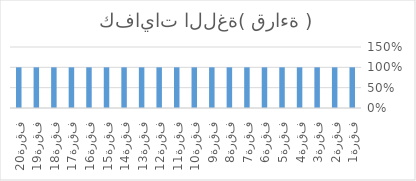
| Category | Series 0 |
|---|---|
| فقرة1 | 1 |
| فقرة2 | 1 |
| فقرة3 | 1 |
| فقرة4 | 1 |
| فقرة5 | 1 |
| فقرة6 | 1 |
| فقرة7 | 1 |
| فقرة8 | 1 |
| فقرة9 | 1 |
| فقرة10 | 1 |
| فقرة11 | 1 |
| فقرة12 | 1 |
| فقرة13 | 1 |
| فقرة14 | 1 |
| فقرة15 | 1 |
| فقرة16 | 1 |
| فقرة17 | 1 |
| فقرة18 | 1 |
| فقرة19 | 1 |
| فقرة20 | 1 |